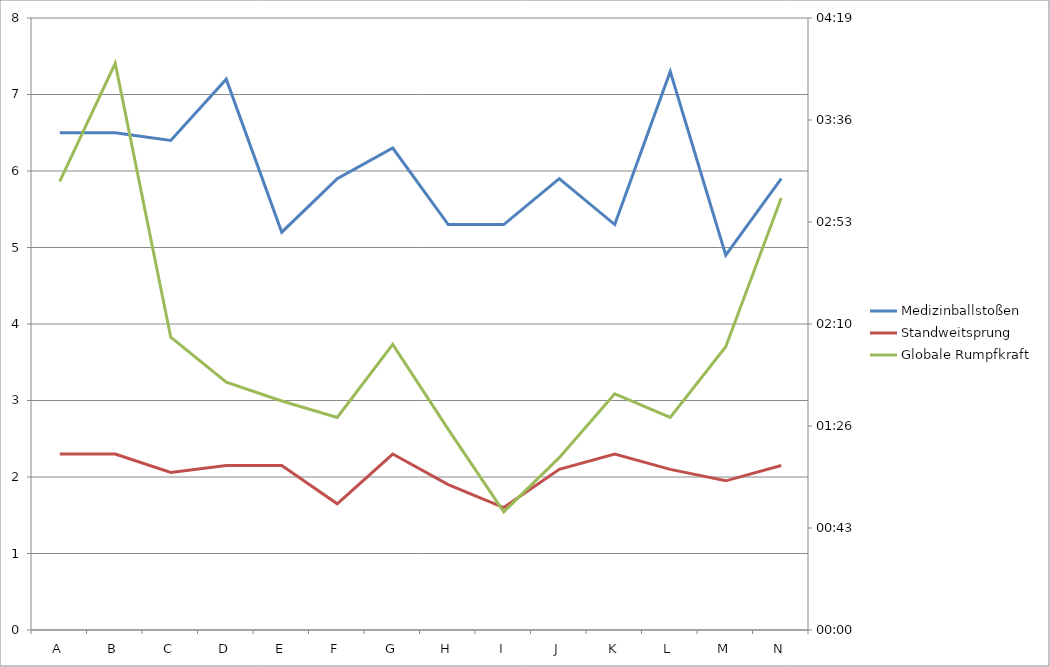
| Category | Medizinballstoßen | Standweitsprung |
|---|---|---|
| A | 6.5 | 2.3 |
| B | 6.5 | 2.3 |
| C | 6.4 | 2.06 |
| D | 7.2 | 2.15 |
| E | 5.2 | 2.15 |
| F | 5.9 | 1.65 |
| G | 6.3 | 2.3 |
| H | 5.3 | 1.9 |
| I | 5.3 | 1.6 |
| J | 5.9 | 2.1 |
| K | 5.3 | 2.3 |
| L | 7.3 | 2.1 |
| M | 4.9 | 1.95 |
| N | 5.9 | 2.15 |